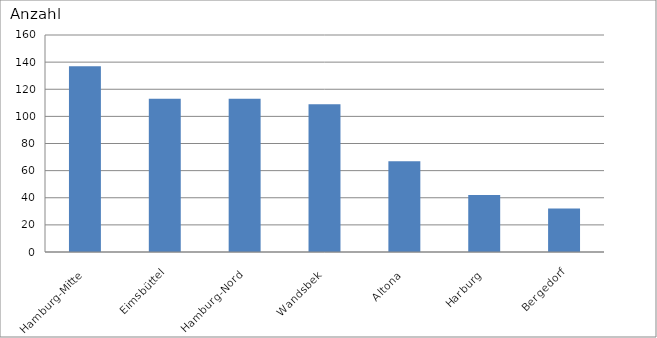
| Category | Hamburg-Mitte Eimsbüttel Hamburg-Nord Wandsbek Altona Harburg Bergedorf |
|---|---|
| Hamburg-Mitte | 137 |
| Eimsbüttel | 113 |
| Hamburg-Nord | 113 |
| Wandsbek | 109 |
| Altona | 67 |
| Harburg | 42 |
| Bergedorf | 32 |